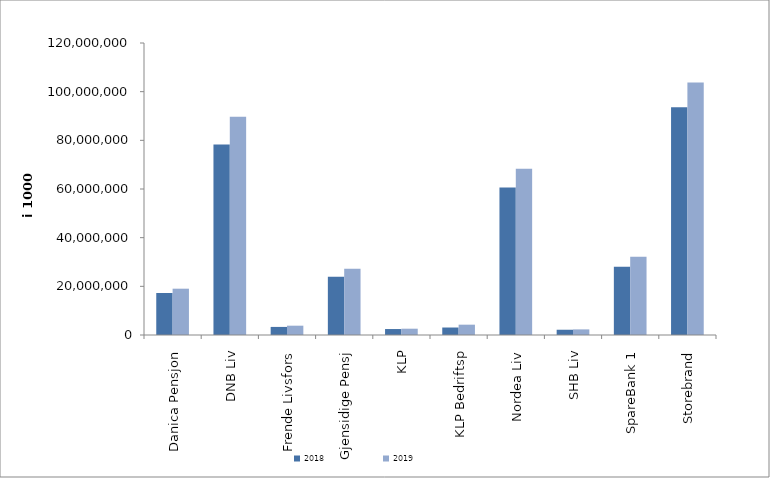
| Category | 2018 | 2019 |
|---|---|---|
| Danica Pensjon | 17266330.386 | 19030607.529 |
| DNB Liv | 78277486.438 | 89715002.027 |
| Frende Livsfors | 3320021 | 3826787 |
| Gjensidige Pensj | 23904710 | 27221258.8 |
| KLP | 2451095.821 | 2587219.183 |
| KLP Bedriftsp | 3075141 | 4242225 |
| Nordea Liv | 60641550 | 68352090 |
| SHB Liv | 2163599 | 2307693.04 |
| SpareBank 1 | 28011120.556 | 32200221.13 |
| Storebrand | 93597754.061 | 103774197.524 |